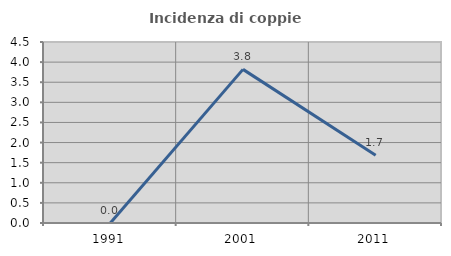
| Category | Incidenza di coppie miste |
|---|---|
| 1991.0 | 0 |
| 2001.0 | 3.819 |
| 2011.0 | 1.684 |